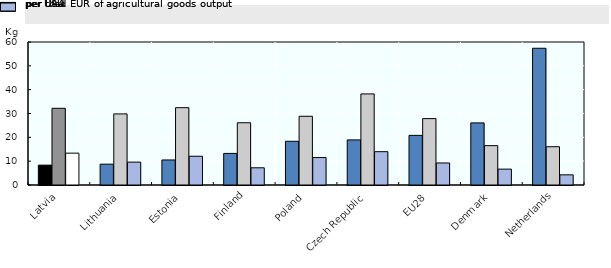
| Category | per UAA | per LSU | per thsd EUR of agricultural goods output |
|---|---|---|---|
| Latvia | 8.33 | 32.184 | 13.362 |
| Lithuania | 8.745 | 29.832 | 9.601 |
| Estonia | 10.506 | 32.44 | 12.064 |
| Finland | 13.255 | 26.12 | 7.219 |
| Poland | 18.341 | 28.838 | 11.514 |
| Czech Republic | 18.917 | 38.214 | 13.979 |
| EU28 | 20.82 | 27.856 | 9.243 |
| Denmark | 26.057 | 16.512 | 6.656 |
| Netherlands | 57.376 | 16.057 | 4.267 |